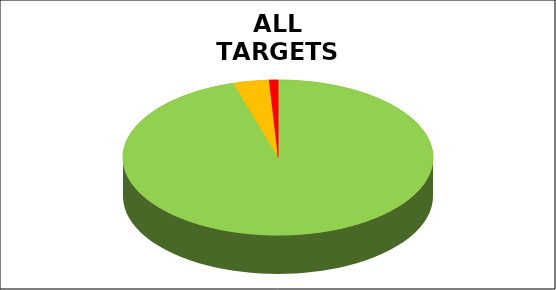
| Category | Series 0 |
|---|---|
| Green | 0.953 |
| Amber | 0.037 |
| Red | 0.009 |